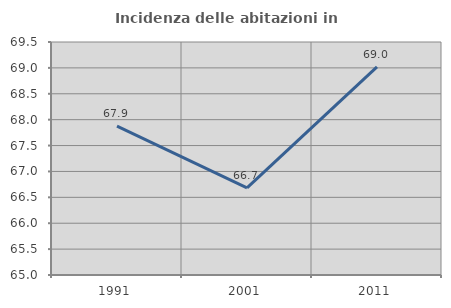
| Category | Incidenza delle abitazioni in proprietà  |
|---|---|
| 1991.0 | 67.875 |
| 2001.0 | 66.682 |
| 2011.0 | 69.021 |